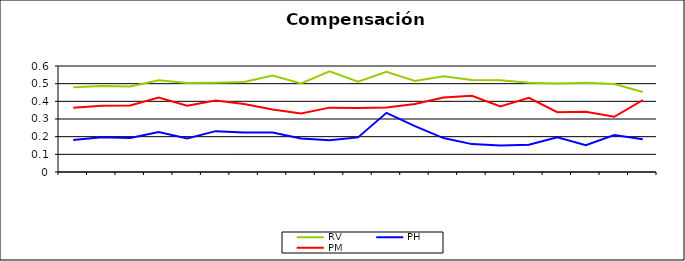
| Category | RV | PH | PM |
|---|---|---|---|
| 0 | 0.479 | 0.181 | 0.364 |
| 1 | 0.487 | 0.196 | 0.375 |
| 2 | 0.484 | 0.192 | 0.376 |
| 3 | 0.52 | 0.226 | 0.421 |
| 4 | 0.504 | 0.189 | 0.375 |
| 5 | 0.506 | 0.231 | 0.404 |
| 6 | 0.51 | 0.224 | 0.384 |
| 7 | 0.546 | 0.223 | 0.353 |
| 8 | 0.501 | 0.19 | 0.331 |
| 9 | 0.57 | 0.18 | 0.364 |
| 10 | 0.511 | 0.196 | 0.363 |
| 11 | 0.567 | 0.335 | 0.365 |
| 12 | 0.515 | 0.26 | 0.385 |
| 13 | 0.543 | 0.192 | 0.422 |
| 14 | 0.52 | 0.158 | 0.431 |
| 15 | 0.519 | 0.15 | 0.371 |
| 16 | 0.505 | 0.154 | 0.42 |
| 17 | 0.501 | 0.196 | 0.339 |
| 18 | 0.506 | 0.151 | 0.341 |
| 19 | 0.498 | 0.209 | 0.313 |
| 20 | 0.453 | 0.186 | 0.407 |